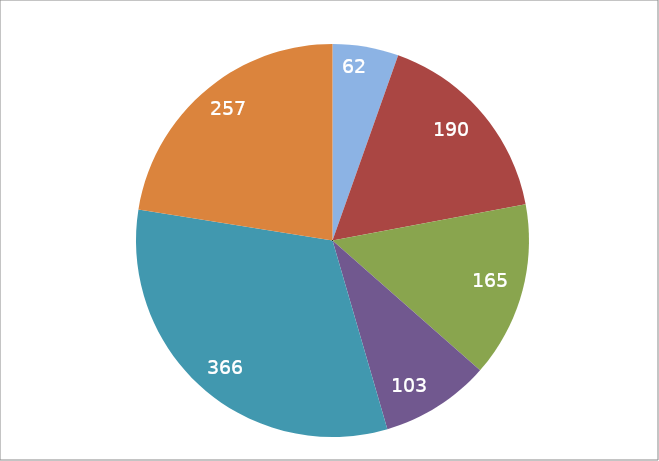
| Category | Series 1 |
|---|---|
| Verarbeitendes Gewerbe | 62 |
| Baugewerbe | 190 |
| Groß- und Einzelhandel2  | 165 |
| Gastgewerbe | 103 |
| Grundstücks- und Wohnungswesen3 und Sonstige Dienstleistungen4 | 366 |
| übrige | 257 |